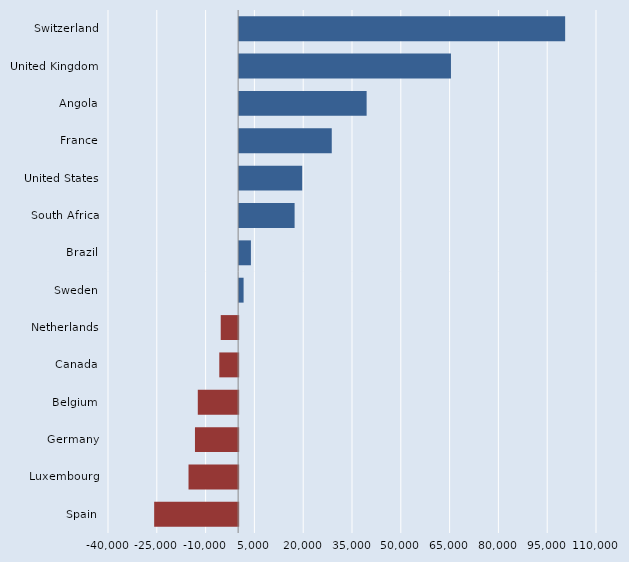
| Category | Series 0 |
|---|---|
| Switzerland | 100210 |
| United Kingdom | 65110 |
| Angola | 39190 |
| France | 28470 |
| United States | 19390 |
| South Africa | 17050 |
| Brazil | 3620 |
| Sweden | 1370 |
| Netherlands | -5350 |
| Canada | -5790 |
| Belgium | -12400 |
| Germany | -13270 |
| Luxembourg | -15250 |
| Spain | -25810 |